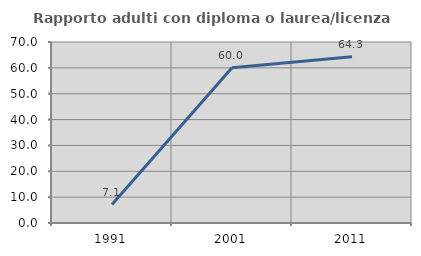
| Category | Rapporto adulti con diploma o laurea/licenza media  |
|---|---|
| 1991.0 | 7.143 |
| 2001.0 | 60 |
| 2011.0 | 64.286 |